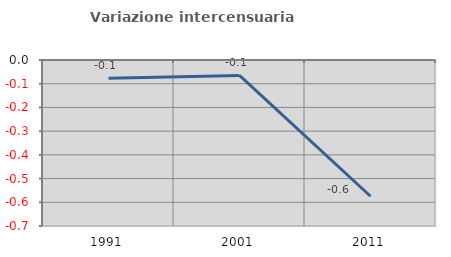
| Category | Variazione intercensuaria annua |
|---|---|
| 1991.0 | -0.077 |
| 2001.0 | -0.065 |
| 2011.0 | -0.575 |